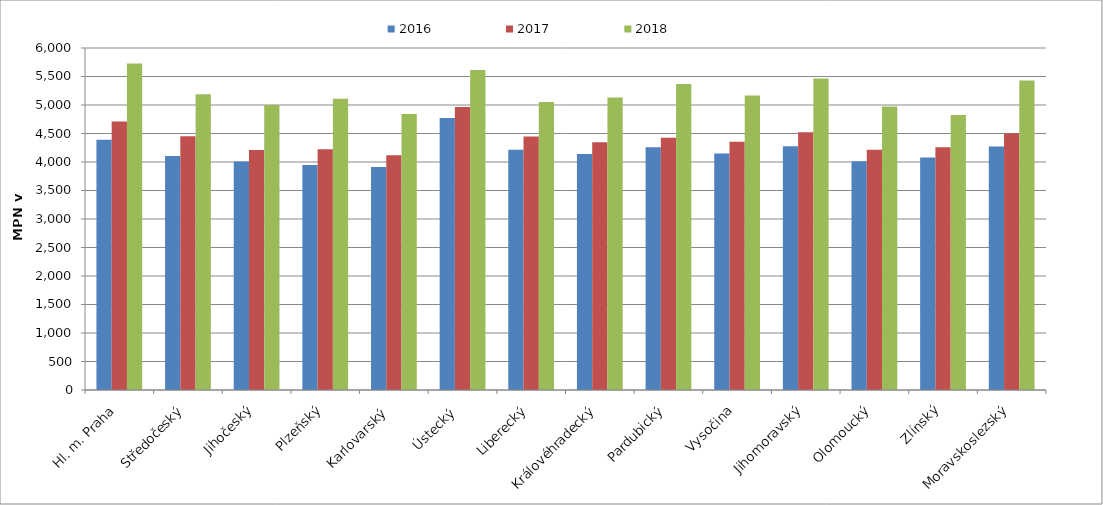
| Category | 2016 | 2017 | 2018 |
|---|---|---|---|
| Hl. m. Praha | 4391.653 | 4710.346 | 5729.434 |
| Středočeský | 4104.07 | 4450.71 | 5190.239 |
| Jihočeský | 4009.539 | 4209.487 | 4998.645 |
| Plzeňský | 3947.135 | 4223.377 | 5109.628 |
| Karlovarský  | 3913.228 | 4117.397 | 4841.063 |
| Ústecký   | 4773.59 | 4964.414 | 5615.925 |
| Liberecký | 4213.294 | 4446.143 | 5054.038 |
| Královéhradecký | 4140.745 | 4347.63 | 5131.682 |
| Pardubický | 4256.912 | 4427.393 | 5368.773 |
| Vysočina | 4147.206 | 4354.531 | 5168.508 |
| Jihomoravský | 4277.883 | 4522.228 | 5463.442 |
| Olomoucký | 4012.754 | 4213.544 | 4973.185 |
| Zlínský | 4078.631 | 4259.769 | 4824.606 |
| Moravskoslezský | 4272.306 | 4505.214 | 5431.859 |